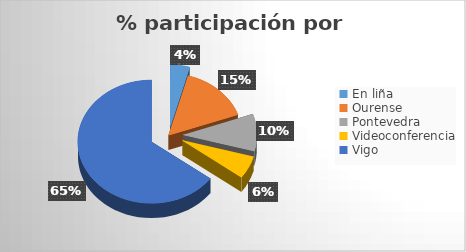
| Category | Series 0 |
|---|---|
| En liña | 25 |
| Ourense | 90 |
| Pontevedra | 57 |
| Videoconferencia | 35 |
| Vigo | 381 |